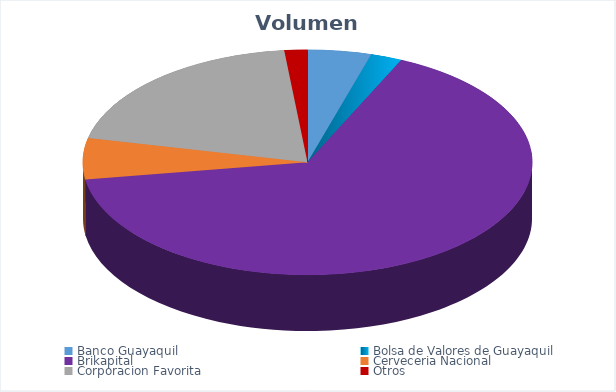
| Category | VOLUMEN ($USD) |
|---|---|
| Banco Guayaquil | 2784.39 |
| Bolsa de Valores de Guayaquil | 1370.4 |
| Brikapital | 40000 |
| Cerveceria Nacional | 3598.8 |
| Corporacion Favorita | 12088.22 |
| Otros | 1005 |